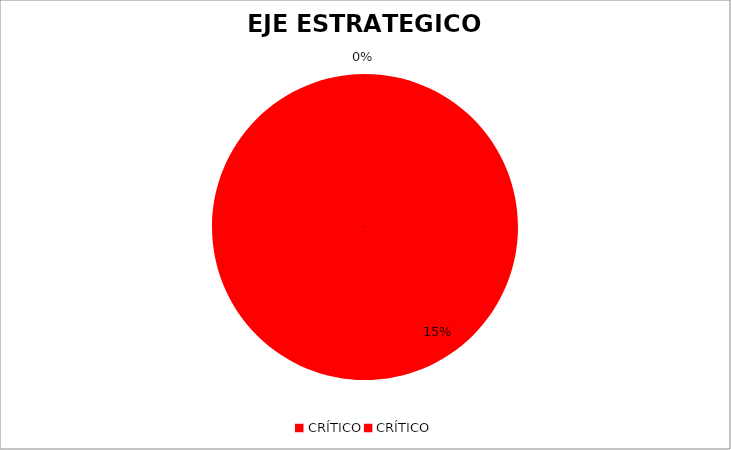
| Category | Series 0 |
|---|---|
| CRÍTICO | 0 |
| CRÍTICO | 0.15 |